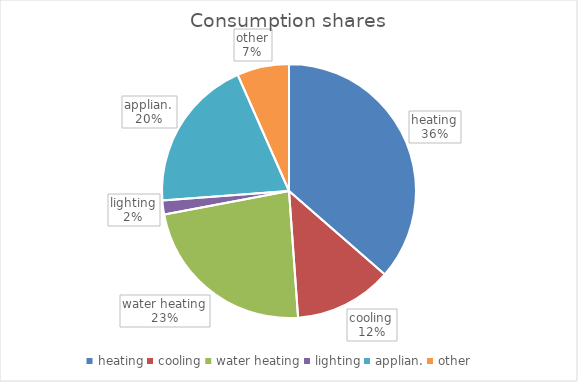
| Category | Series 0 |
|---|---|
| heating | 2489219.794 |
| cooling | 851760 |
| water heating | 1584048.96 |
| lighting | 121680 |
| applian. | 1338480 |
| other | 452585.417 |